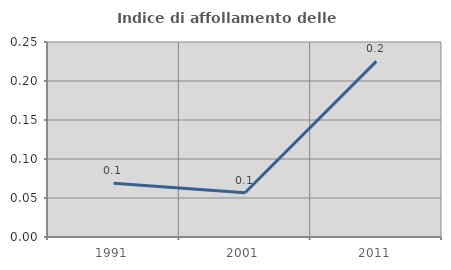
| Category | Indice di affollamento delle abitazioni  |
|---|---|
| 1991.0 | 0.069 |
| 2001.0 | 0.057 |
| 2011.0 | 0.225 |